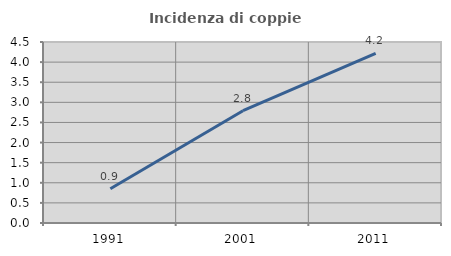
| Category | Incidenza di coppie miste |
|---|---|
| 1991.0 | 0.853 |
| 2001.0 | 2.793 |
| 2011.0 | 4.219 |